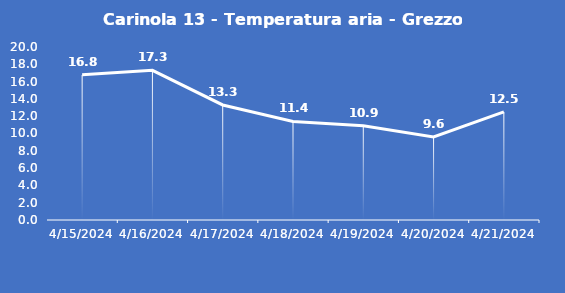
| Category | Carinola 13 - Temperatura aria - Grezzo (°C) |
|---|---|
| 4/15/24 | 16.8 |
| 4/16/24 | 17.3 |
| 4/17/24 | 13.3 |
| 4/18/24 | 11.4 |
| 4/19/24 | 10.9 |
| 4/20/24 | 9.6 |
| 4/21/24 | 12.5 |